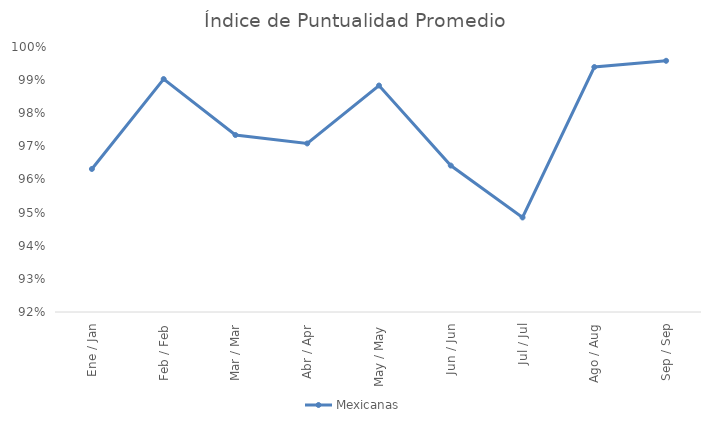
| Category | Mexicanas |
|---|---|
| Ene / Jan | 0.963 |
| Feb / Feb | 0.99 |
| Mar / Mar | 0.973 |
| Abr / Apr | 0.971 |
| May / May | 0.988 |
| Jun / Jun | 0.964 |
| Jul / Jul | 0.949 |
| Ago / Aug | 0.994 |
| Sep / Sep | 0.996 |